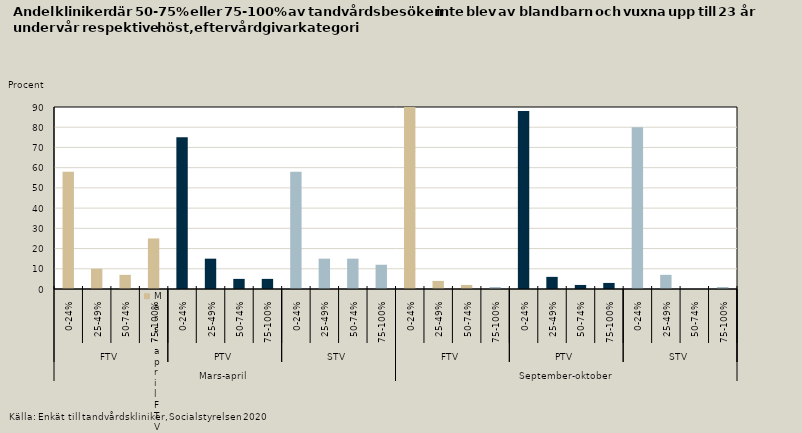
| Category | Barn och vuxna uppt ill 23 år |
|---|---|
| 0 | 58 |
| 1 | 10 |
| 2 | 7 |
| 3 | 25 |
| 4 | 75 |
| 5 | 15 |
| 6 | 5 |
| 7 | 5 |
| 8 | 58 |
| 9 | 15 |
| 10 | 15 |
| 11 | 12 |
| 12 | 94 |
| 13 | 4 |
| 14 | 2 |
| 15 | 1 |
| 16 | 88 |
| 17 | 6 |
| 18 | 2 |
| 19 | 3 |
| 20 | 80 |
| 21 | 7 |
| 22 | 0 |
| 23 | 1 |